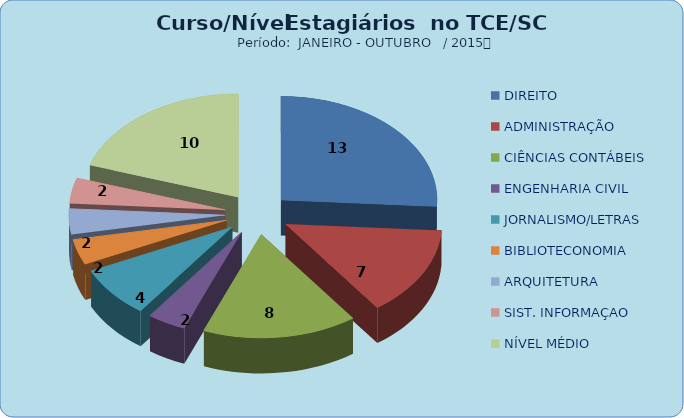
| Category | Series 0 |
|---|---|
| DIREITO | 13 |
| ADMINISTRAÇÃO | 7 |
| CIÊNCIAS CONTÁBEIS | 8 |
| ENGENHARIA CIVIL | 2 |
| JORNALISMO/LETRAS | 4 |
| BIBLIOTECONOMIA | 2 |
| ARQUITETURA | 2 |
| SIST. INFORMAÇAO | 2 |
| NÍVEL MÉDIO | 10 |